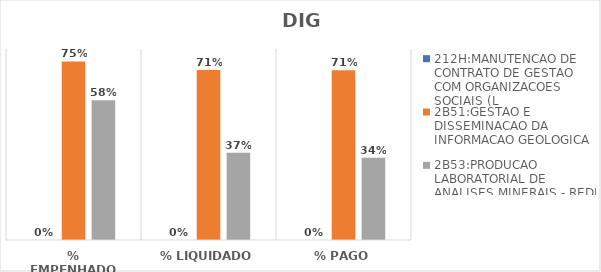
| Category | 212H:MANUTENCAO DE CONTRATO DE GESTAO COM ORGANIZACOES SOCIAIS (L | 2B51:GESTAO E DISSEMINACAO DA INFORMACAO GEOLOGICA | 2B53:PRODUCAO LABORATORIAL DE ANALISES MINERAIS - REDE LAMIN |
|---|---|---|---|
| % EMPENHADO | 0 | 0.748 | 0.585 |
| % LIQUIDADO | 0 | 0.712 | 0.365 |
| % PAGO | 0 | 0.711 | 0.344 |